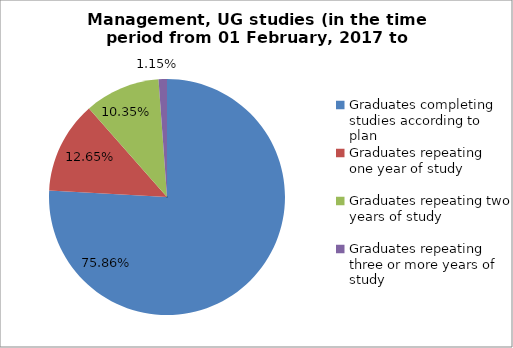
| Category | Series 0 |
|---|---|
| Graduates completing studies according to plan | 75.862 |
| Graduates repeating one year of study | 12.644 |
| Graduates repeating two years of study | 10.345 |
| Graduates repeating three or more years of study | 1.149 |